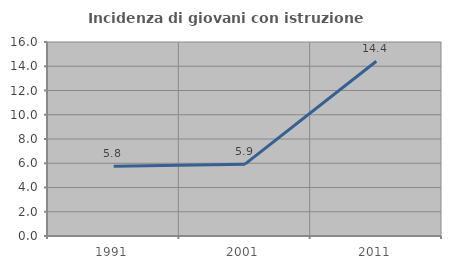
| Category | Incidenza di giovani con istruzione universitaria |
|---|---|
| 1991.0 | 5.755 |
| 2001.0 | 5.926 |
| 2011.0 | 14.414 |